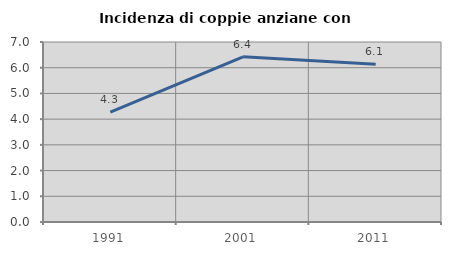
| Category | Incidenza di coppie anziane con figli |
|---|---|
| 1991.0 | 4.277 |
| 2001.0 | 6.422 |
| 2011.0 | 6.136 |